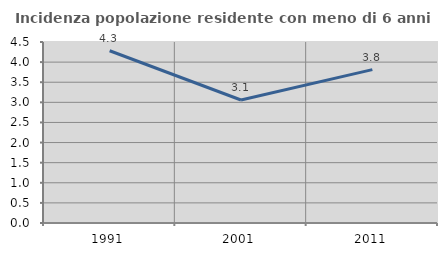
| Category | Incidenza popolazione residente con meno di 6 anni |
|---|---|
| 1991.0 | 4.282 |
| 2001.0 | 3.059 |
| 2011.0 | 3.814 |